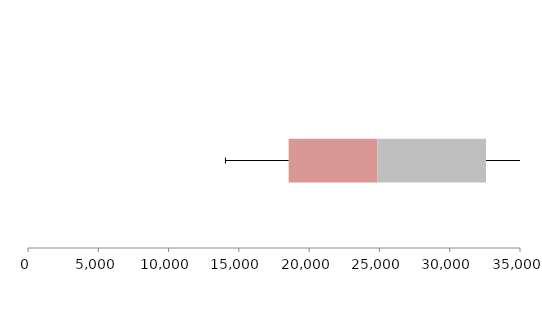
| Category | Series 1 | Series 2 | Series 3 |
|---|---|---|---|
| 0 | 18541.427 | 6321.298 | 7720.801 |